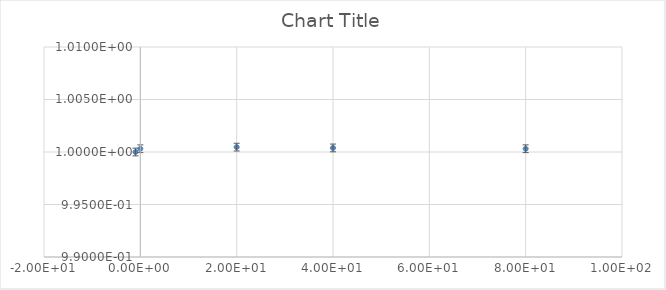
| Category | Series 0 |
|---|---|
| 0.0 | 1 |
| 20.0 | 1 |
| 40.0 | 1 |
| 80.0 | 1 |
| -1.0 | 1 |